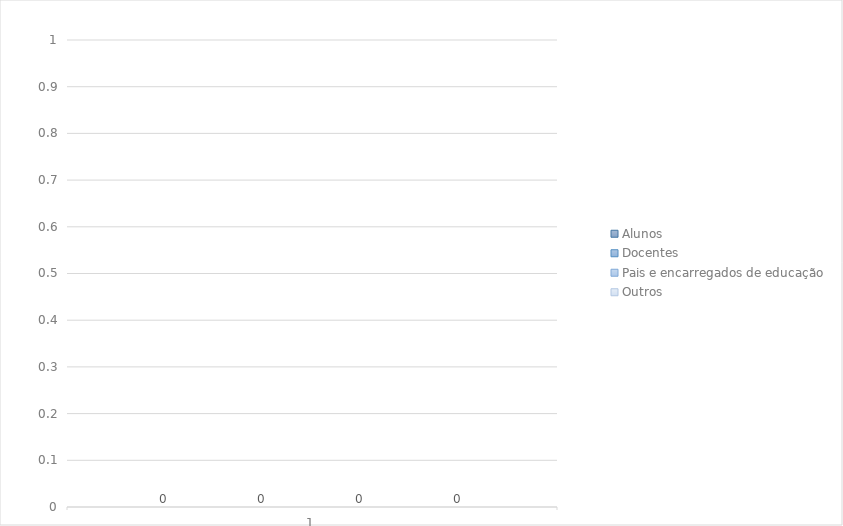
| Category | Alunos | Docentes | Pais e encarregados de educação | Outros |
|---|---|---|---|---|
| 0 | 0 | 0 | 0 | 0 |